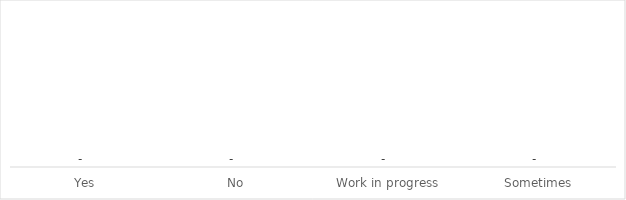
| Category | Series 0 |
|---|---|
| Yes | 0 |
| No | 0 |
| Work in progress | 0 |
| Sometimes | 0 |